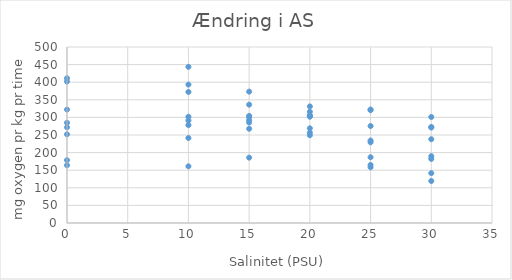
| Category | Series 0 |
|---|---|
| 0.0 | 271.82 |
| 0.0 | 164.18 |
| 0.0 | 322.21 |
| 0.0 | 411.24 |
| 0.0 | 401.96 |
| 0.0 | 284.64 |
| 0.0 | 252.04 |
| 0.0 | 178.61 |
| 10.0 | 161.08 |
| 10.0 | 290.98 |
| 10.0 | 241.53 |
| 10.0 | 278.12 |
| 10.0 | 372.32 |
| 10.0 | 301.96 |
| 10.0 | 443.69 |
| 10.0 | 393.26 |
| 15.0 | 285.55 |
| 15.0 | 185.71 |
| 15.0 | 267.79 |
| 15.0 | 304.31 |
| 15.0 | 373.19 |
| 15.0 | 300.53 |
| 15.0 | 291.56 |
| 15.0 | 336.17 |
| 20.0 | 249.32 |
| 20.0 | 331.26 |
| 20.0 | 303.15 |
| 20.0 | 316.08 |
| 20.0 | 269.02 |
| 20.0 | 256.73 |
| 20.0 | 302.08 |
| 20.0 | 306.59 |
| 25.0 | 164.99 |
| 25.0 | 158.22 |
| 25.0 | 275.53 |
| 25.0 | 229.17 |
| 25.0 | 186.76 |
| 25.0 | 320.48 |
| 25.0 | 322.5 |
| 25.0 | 234.38 |
| 30.0 | 189.89 |
| 30.0 | 141.59 |
| 30.0 | 272.84 |
| 30.0 | 301.19 |
| 30.0 | 238 |
| 30.0 | 271.17 |
| 30.0 | 182.06 |
| 30.0 | 119.33 |